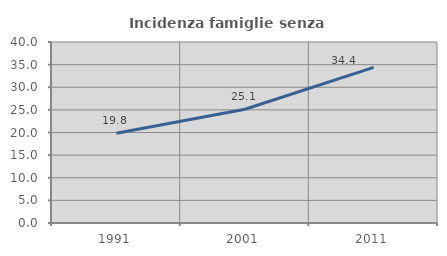
| Category | Incidenza famiglie senza nuclei |
|---|---|
| 1991.0 | 19.812 |
| 2001.0 | 25.132 |
| 2011.0 | 34.405 |